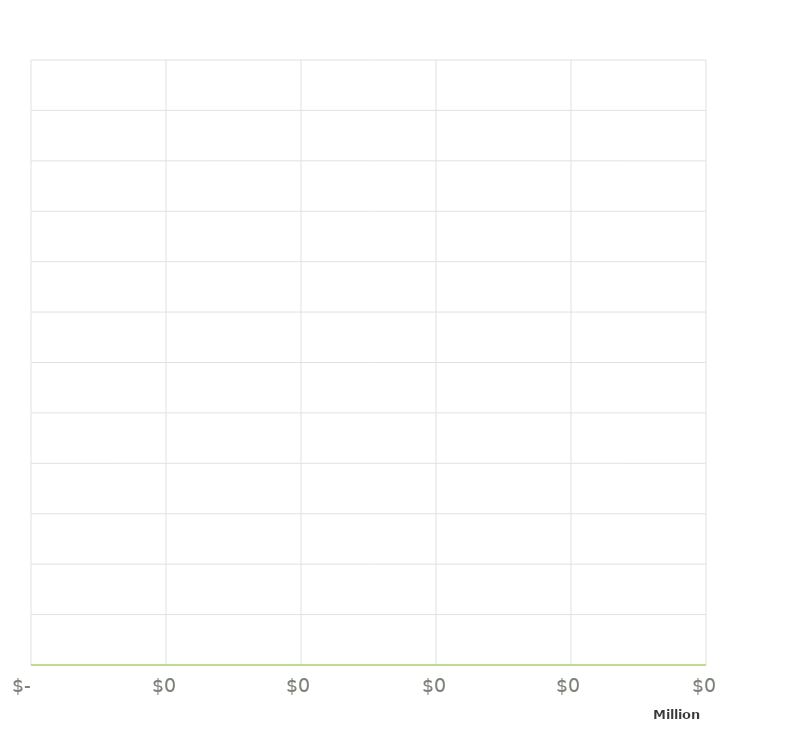
| Category | Climate Impact |
|---|---|
| Promotion of road safety and demand management | 0 |
| Walking and cycling improvements | 0 |
| Public transport services | 0 |
| Public transport infrastructure | 0 |
| Local road maintenance | 0 |
| State highway maintenance | 0 |
| Local road improvements | 0 |
| State highway improvements | 0 |
| Regional Improvements | 0 |
| Rapid Transit | 0 |
| Transitional Rail | 0 |
| Road to Zero | 0 |